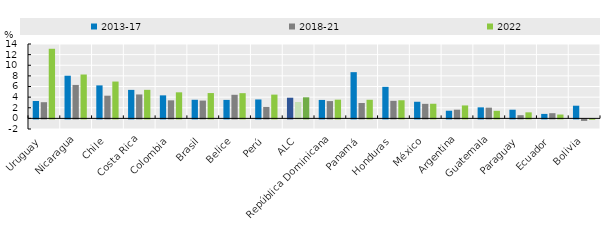
| Category | 2013-17 | 2018-21 | 2022 |
|---|---|---|---|
| Uruguay | 3.272 | 3.045 | 13.101 |
| Nicaragua | 8.031 | 6.295 | 8.257 |
| Chile | 6.209 | 4.272 | 6.931 |
| Costa Rica | 5.363 | 4.503 | 5.371 |
| Colombia | 4.333 | 3.396 | 4.905 |
| Brasil | 3.502 | 3.348 | 4.765 |
| Belice | 3.479 | 4.439 | 4.745 |
| Perú | 3.558 | 2.15 | 4.471 |
| ALC | 3.887 | 3.081 | 3.965 |
| República Dominicana | 3.47 | 3.255 | 3.52 |
| Panamá | 8.7 | 2.9 | 3.5 |
| Honduras | 5.937 | 3.302 | 3.411 |
| México | 3.128 | 2.735 | 2.753 |
| Argentina | 1.441 | 1.634 | 2.435 |
| Guatemala | 2.077 | 2.022 | 1.423 |
| Paraguay | 1.629 | 0.601 | 1.136 |
| Ecuador | 0.842 | 0.976 | 0.721 |
| Bolivia | 2.385 | -0.288 | -0.06 |